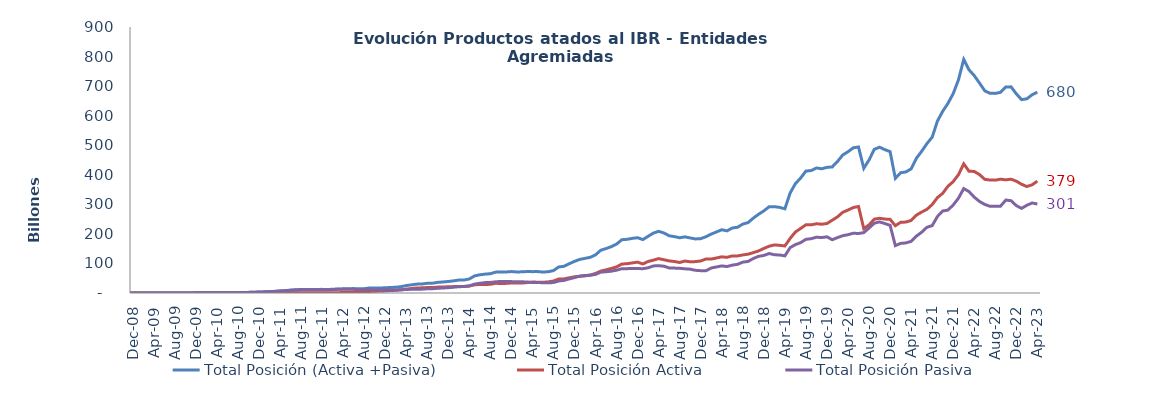
| Category | Total Posición (Activa +Pasiva) | Total Posición Activa | Total Posición Pasiva |
|---|---|---|---|
| 2008-07-01 | 0 | 0 | 0 |
| 2008-08-01 | 0 | 0 | 0 |
| 2008-09-01 | 1000000 | 0 | 1000000 |
| 2008-10-01 | 1000000 | 0 | 1000000 |
| 2008-11-01 | 0 | 0 | 0 |
| 2008-12-01 | 0 | 0 | 0 |
| 2009-01-01 | 0 | 0 | 0 |
| 2009-02-01 | 7428500000 | 7428500000 | 0 |
| 2009-03-01 | 7428500000 | 7428500000 | 0 |
| 2009-04-01 | 7428500000 | 7428500000 | 0 |
| 2009-05-01 | 7428500000 | 7428500000 | 0 |
| 2009-06-01 | 7428500000 | 7428500000 | 0 |
| 2009-07-01 | 184628500000 | 7428500000 | 177200000000 |
| 2009-08-01 | 184628500000 | 7428500000 | 177200000000 |
| 2009-09-01 | 184628500000 | 7428500000 | 177200000000 |
| 2009-10-01 | 185129500000 | 7928500000 | 177201000000 |
| 2009-11-01 | 333829500000 | 22928500000 | 310901000000 |
| 2009-12-01 | 508529500000 | 22928500000 | 485601000000 |
| 2010-01-01 | 523329500000 | 23328500000 | 500001000000 |
| 2010-02-01 | 561579500000 | 23328500000 | 538251000000 |
| 2010-03-01 | 890799500000 | 24228500000 | 866571000000 |
| 2010-04-01 | 934149500000 | 32228500000 | 901921000000 |
| 2010-05-01 | 972149500000 | 46928500000 | 925221000000 |
| 2010-06-01 | 1019749500000 | 57928500000 | 961821000000 |
| 2010-07-01 | 1054749500000 | 71928500000 | 982821000000 |
| 2010-08-01 | 1096821000000 | 66500000000 | 1030321000000 |
| 2010-09-01 | 1351421000000 | 57500000000 | 1293921000000 |
| 2010-10-01 | 2086289000000 | 111000000000 | 1975289000000 |
| 2010-11-01 | 2726579030230 | 114000000000 | 2612579030230 |
| 2010-12-01 | 3205380030230 | 113971000000 | 3091409030230 |
| 2011-01-01 | 3891216030230 | 114971000000 | 3776245030230 |
| 2011-02-01 | 4740024311520 | 219471000000 | 4520553311520 |
| 2011-03-01 | 5575075311520 | 377371000000 | 5197704311520 |
| 2011-04-01 | 7038592281290 | 509371000000 | 6529221281290 |
| 2011-05-01 | 8099489881774 | 597145000000 | 7502344881774 |
| 2011-06-01 | 9725086346191 | 765169000000 | 8959917346191 |
| 2011-07-01 | 10999513570652 | 996669000000 | 10002844570652 |
| 2011-08-01 | 11811490085668 | 1214169000000 | 10597321085668 |
| 2011-09-01 | 12092316282168 | 1148069000000 | 10944247282168 |
| 2011-10-01 | 11974470459718 | 1135571874050 | 10838898585668 |
| 2011-11-01 | 12176418287184 | 984599000000 | 11191819287184 |
| 2011-12-01 | 12288842763684 | 983099000000 | 11305743763684 |
| 2012-01-01 | 11701287811238 | 1008599000000 | 10692688811238 |
| 2012-02-01 | 12706230411238 | 1105569000000 | 11600661411238 |
| 2012-03-01 | 13561575207334 | 1160099000000 | 12401476207334 |
| 2012-04-01 | 14046325467338 | 1471099000000 | 12575226467338 |
| 2012-05-01 | 14094647073338 | 1804949000000 | 12289698073338 |
| 2012-06-01 | 14980264763536 | 2682753000000 | 12297511763536 |
| 2012-07-01 | 13983506536392.6 | 2975989400932.6 | 11007517135460 |
| 2012-08-01 | 14511342381537.73 | 3747251409383.73 | 10764090972154 |
| 2012-09-01 | 16937362887762.46 | 5346076915608.46 | 11591285972154 |
| 2012-10-01 | 16867323467297.76 | 5927222995143.76 | 10940100472154 |
| 2012-11-01 | 16957687120024.45 | 6827721606539.45 | 10129965513485 |
| 2012-12-01 | 17619213721064.83 | 7264421085065.83 | 10354792635999 |
| 2013-01-01 | 18549778788681.95 | 8296359799905.279 | 10253418988776.67 |
| 2013-02-01 | 19435840251568.38 | 9025528305106.379 | 10410311946462 |
| 2013-03-01 | 21350496757475.97 | 10610182541484.97 | 10740314215991 |
| 2013-04-01 | 25044328892886.617 | 13133059577950.62 | 11911269314936 |
| 2013-05-01 | 27540403190960.062 | 14960233266686.31 | 12580169924273.75 |
| 2013-06-01 | 30001766547101.754 | 17049524776131 | 12952241770970.75 |
| 2013-07-01 | 30415841990108.754 | 17382486278583 | 13033355711525.75 |
| 2013-08-01 | 32855099846458.246 | 18580739748972 | 14274360097486.25 |
| 2013-09-01 | 32976502369371.246 | 18407429561787 | 14569072807584.25 |
| 2013-10-01 | 35959569368735.19 | 19992346917073.383 | 15967222451661.8 |
| 2013-11-01 | 37338647357799.75 | 20384941433230.95 | 16953705924568.8 |
| 2013-12-01 | 38888505779144.55 | 20939970782609.754 | 17948534996534.8 |
| 2014-01-01 | 41103172396366.16 | 21609706461008.36 | 19493465935357.8 |
| 2014-02-01 | 43730091166840.81 | 22338455450529.008 | 21391635716311.8 |
| 2014-03-01 | 44014768230115.07 | 22272030193312.27 | 21742738036802.8 |
| 2014-04-01 | 47430724239336.83 | 23422937479203.03 | 24007786760133.8 |
| 2014-05-01 | 57834426276868.516 | 27674659964612.28 | 30159766312256.23 |
| 2014-06-01 | 61600955025680.43 | 28872171652456.2 | 32728783373224.23 |
| 2014-07-01 | 63885132140809.125 | 28702458561582.03 | 35182673579227.09 |
| 2014-08-01 | 65175133555848.31 | 29435167088741.88 | 35739966467106.44 |
| 2014-09-01 | 70606691467799.84 | 32831024190733.098 | 37775667277066.74 |
| 2014-10-01 | 71051997442592.78 | 31855183242802.297 | 39196814199790.49 |
| 2014-11-01 | 71115134748566.56 | 32585871229814.906 | 38529263518751.65 |
| 2014-12-01 | 72525676073088.9 | 33921493945222.32 | 38604182127866.58 |
| 2015-01-01 | 71271574040027.69 | 33430948122193.57 | 37840625917834.125 |
| 2015-02-01 | 71566513266069.4 | 33707551044151.4 | 37858962221918 |
| 2015-03-01 | 72569028292197.1 | 35240251694194.734 | 37328776598002.37 |
| 2015-04-01 | 72284407635002.38 | 36978226535327.29 | 35306181099675.08 |
| 2015-05-01 | 72379825993554.31 | 36677826813740.74 | 35701999179813.58 |
| 2015-06-01 | 70934232494211.97 | 36341054921697.64 | 34593177572514.32 |
| 2015-07-01 | 71925911515818.6 | 37449597485067.67 | 34476314030750.92 |
| 2015-08-01 | 75819411537731.48 | 40476268719214.67 | 35343142818516.81 |
| 2015-09-01 | 88024514896767.1 | 47423423192943 | 40601091703824.09 |
| 2015-10-01 | 90376727278611.56 | 47767203933521.14 | 42609523345090.43 |
| 2015-11-01 | 99012993745053.11 | 51298569770898.03 | 47714423974155.08 |
| 2015-12-01 | 107008749487979.02 | 54758099038919.11 | 52250650449059.89 |
| 2016-01-01 | 113661574588642.9 | 56331160756973.97 | 57330413831668.94 |
| 2016-02-01 | 117225015006954.34 | 57909509197116.14 | 59315505809838.21 |
| 2016-03-01 | 120669820452450.66 | 60722748977001.484 | 59947071475449.17 |
| 2016-04-01 | 129040983634768.84 | 66178255126135.42 | 62862728508633.42 |
| 2016-05-01 | 144700379703761.53 | 74162617699926 | 70537762003835.53 |
| 2016-06-01 | 150304379111854.44 | 78377250605963.84 | 71927128505890.6 |
| 2016-07-01 | 156812723823687.1 | 82955508331840.11 | 73857215491846.98 |
| 2016-08-01 | 165444572236951 | 88276550125987.88 | 77168022110963.12 |
| 2016-09-01 | 180247481204752.16 | 97990348411005.16 | 82257132793747.02 |
| 2016-10-01 | 181569726283085.44 | 99190320785310.78 | 82379405497774.64 |
| 2016-11-01 | 184930356175967.25 | 101858145365331.95 | 83072210810635.31 |
| 2016-12-01 | 187019078701499.56 | 104426020271926.45 | 82593058429573.12 |
| 2017-01-01 | 180717599779259.44 | 98342098801930.34 | 82375500977329.1 |
| 2017-02-01 | 191914936110978.38 | 106635932569865.05 | 85279003541113.31 |
| 2017-03-01 | 202712151186918.75 | 111093841827062.03 | 91618309359856.7 |
| 2017-04-01 | 208712921786598.44 | 116358628666288.72 | 92354293120309.72 |
| 2017-05-01 | 203156118525042.3 | 112464530045620.02 | 90691588479422.28 |
| 2017-06-01 | 193587897232076.56 | 108642745845616.36 | 84945151386460.22 |
| 2017-07-01 | 190785975919763.38 | 106534349795344.66 | 84251626124418.72 |
| 2017-08-01 | 186835458365348.25 | 103243442359903.69 | 83592016005444.58 |
| 2017-09-01 | 189956082995096.8 | 108148190109574.17 | 81807892885522.62 |
| 2017-10-01 | 186238156699396.06 | 105639300759532 | 80598855939864.06 |
| 2017-11-01 | 182912971216385.97 | 106198065459860.58 | 76714905756525.44 |
| 2017-12-01 | 183933570178700.62 | 108408970543558.03 | 75524599635142.58 |
| 2018-01-01 | 190424775932458.47 | 114943825229509.72 | 75480950702948.75 |
| 2018-02-01 | 199397563470704.5 | 114794441925964.78 | 84603121544739.73 |
| 2018-03-01 | 206599379846535.78 | 118542976386628.56 | 88056403459907.22 |
| 2018-04-01 | 214049245063754.12 | 122316493524125.72 | 91732751539628.39 |
| 2018-05-01 | 210207792880960.06 | 120682410832846.97 | 89525382048113.08 |
| 2018-06-01 | 219901855771780.88 | 125584292257677.75 | 94317563514103.12 |
| 2018-07-01 | 222464661118893.2 | 125490160168957.62 | 96974500949935.58 |
| 2018-08-01 | 233197164382865.06 | 128762857401461.97 | 104434306981403.1 |
| 2018-09-01 | 238138413897634.5 | 131365417268308.8 | 106772996629325.72 |
| 2018-10-01 | 253384775618417.97 | 136616212577415.81 | 116768563041002.19 |
| 2018-11-01 | 266418937717877.38 | 142363157445231.12 | 124055780272646.25 |
| 2018-12-01 | 277772721069584.12 | 150720411980092.44 | 127052309089491.69 |
| 2019-01-01 | 291858612471002.9 | 158283758995387.56 | 133574853475615.28 |
| 2019-02-01 | 292101641913975.5 | 162644666424391.3 | 129456975489584.22 |
| 2019-03-01 | 289727416506685.4 | 161249314539374.06 | 128478101967311.33 |
| 2019-04-01 | 284896810837116.56 | 159138639592346.12 | 125758171244770.44 |
| 2019-05-01 | 338346503446509.75 | 184718287806282.9 | 153628215640226.88 |
| 2019-06-01 | 370093564258665.06 | 206410540298487.2 | 163683023960177.88 |
| 2019-07-01 | 388961974809432.4 | 218450632039062.62 | 170511342770369.75 |
| 2019-08-01 | 412556863802076.9 | 230894872814072.1 | 181661990988004.75 |
| 2019-09-01 | 414341203404225.75 | 230584707366943.97 | 183756496037281.8 |
| 2019-10-01 | 423121599152430.5 | 234315054373881.84 | 188806544778548.62 |
| 2019-11-01 | 420297583715940.25 | 232795683034519.5 | 187501900681420.72 |
| 2019-12-01 | 425121786712055.25 | 235038128039683.3 | 190083658672371.9 |
| 2020-01-01 | 426547897466937.5 | 246349564127442.88 | 180198333339494.62 |
| 2020-02-01 | 445015612183878.6 | 257562183319233.88 | 187453428864644.78 |
| 2020-03-01 | 466908435177271.6 | 273080219882692 | 193828215294579.6 |
| 2020-04-01 | 478012664506461.7 | 280724367321023 | 197288297185438.7 |
| 2020-05-01 | 491294204608861.5 | 289143178407652.6 | 202151026201208.84 |
| 2020-06-01 | 494001755553993.4 | 292648209938639.06 | 201353545615354.28 |
| 2020-07-01 | 421897016845648 | 217726817580267.44 | 204170199265380.6 |
| 2020-08-01 | 450157495445688.8 | 230369652729561.97 | 219787842716126.8 |
| 2020-09-01 | 486157406122476.75 | 250045295329878.06 | 236112110792598.72 |
| 2020-10-01 | 493373162314760.5 | 252769702045015.75 | 240603460269744.75 |
| 2020-11-01 | 485081126051623.6 | 250153355046954.06 | 234927771004669.53 |
| 2020-12-01 | 478293575994438.06 | 249187844056422.62 | 229105731938015.44 |
| 2021-01-01 | 388001501455800.44 | 227707615566842.16 | 160293885888958.28 |
| 2021-02-01 | 406856741821198 | 239079147320415.75 | 167777594500782.22 |
| 2021-03-01 | 409609975635975.9 | 240042106322322.28 | 169567869313653.6 |
| 2021-04-01 | 419888538467667.9 | 245314153706418.28 | 174574384761249.6 |
| 2021-05-01 | 455864539999708.94 | 263394711246596.22 | 192469828753112.72 |
| 2021-06-01 | 479469802541412.06 | 273854115555433.4 | 205615686985978.66 |
| 2021-07-01 | 505321700010753.8 | 282922473091399 | 222399226919354.8 |
| 2021-08-01 | 527173360741248 | 299273175611739.56 | 227900185129508.4 |
| 2021-09-01 | 581667167821764 | 322769326186093.2 | 258897841635670.78 |
| 2021-10-01 | 614666675991216.6 | 337263611161949.4 | 277403064829267.28 |
| 2021-11-01 | 641637427772897.8 | 361233093292786.6 | 280404334480111.06 |
| 2021-12-01 | 674563413515932.2 | 376724961900496.3 | 297838451615436.06 |
| 2022-01-01 | 721218514955123.5 | 400348499973403.8 | 320870014981719.6 |
| 2022-02-01 | 790315844789493.2 | 437024416355714.44 | 353291428433778.8 |
| 2022-03-01 | 755282628446931.6 | 412113318977231.1 | 343169309469700.5 |
| 2022-04-01 | 735489776826683.2 | 411218606271195.44 | 324271170555487.75 |
| 2022-05-01 | 710331366793997 | 400642853592871.3 | 309688513201125.75 |
| 2022-06-01 | 684117493844022 | 384484097507473.9 | 299633396336548.2 |
| 2022-07-01 | 675528110046386.5 | 382236501527624.7 | 293291608518761.8 |
| 2022-08-01 | 675405283814140 | 381859759101146.6 | 293545524712993.4 |
| 2022-09-01 | 678972775949426.2 | 385109014898452.3 | 293863761050974 |
| 2022-10-01 | 697324285697250.8 | 382865294309152.2 | 314458991388098.56 |
| 2022-11-01 | 697421992105070.1 | 385108668022465.7 | 312313324082604.44 |
| 2022-12-01 | 673858106085518.5 | 378255426548430.5 | 295602679537088.06 |
| 2023-01-01 | 654220816878811.5 | 367924960293289.7 | 286295856585521.75 |
| 2023-02-01 | 657036270751697 | 360176166260983.56 | 296860104490713.4 |
| 2023-03-01 | 670688901569393.5 | 366087041798363.75 | 304601859771029.7 |
| 2023-04-01 | 679501027993546.1 | 378560183852663.75 | 300940844140882.4 |